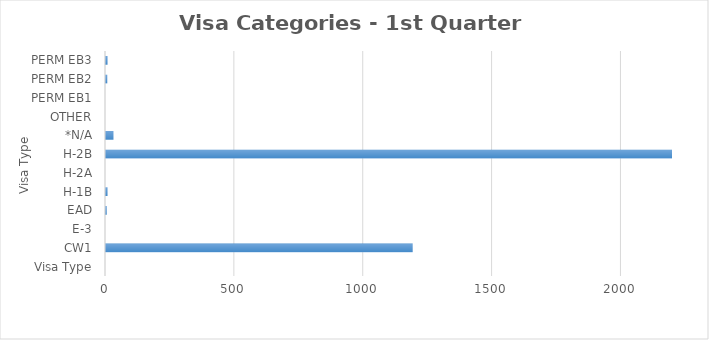
| Category | Series 0 |
|---|---|
| Visa Type | 0 |
| CW1 | 1190 |
| E-3 | 0 |
| EAD | 3 |
| H-1B | 6 |
| H-2A | 0 |
| H-2B | 2857 |
| *N/A | 29 |
| OTHER | 0 |
| PERM EB1 | 0 |
| PERM EB2 | 5 |
| PERM EB3 | 6 |